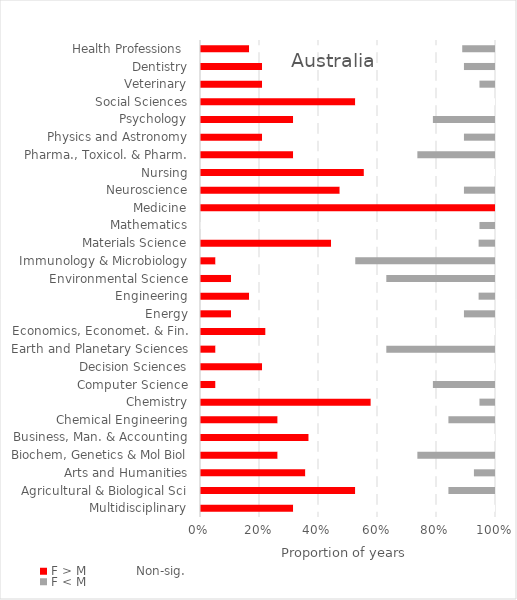
| Category | F > M | Non-sig. | F < M |
|---|---|---|---|
| Multidisciplinary | 6 | 13 | 0 |
| Agricultural & Biological Sci | 10 | 6 | 3 |
| Arts and Humanities | 5 | 8 | 1 |
| Biochem, Genetics & Mol Biol | 5 | 9 | 5 |
| Business, Man. & Accounting | 7 | 12 | 0 |
| Chemical Engineering | 5 | 11 | 3 |
| Chemistry | 11 | 7 | 1 |
| Computer Science | 1 | 14 | 4 |
| Decision Sciences | 4 | 15 | 0 |
| Earth and Planetary Sciences | 1 | 11 | 7 |
| Economics, Economet. & Fin. | 4 | 14 | 0 |
| Energy | 2 | 15 | 2 |
| Engineering | 3 | 14 | 1 |
| Environmental Science | 2 | 10 | 7 |
| Immunology & Microbiology | 1 | 9 | 9 |
| Materials Science | 8 | 9 | 1 |
| Mathematics | 0 | 18 | 1 |
| Medicine | 9 | 0 | 0 |
| Neuroscience | 9 | 8 | 2 |
| Nursing | 10 | 8 | 0 |
| Pharma., Toxicol. & Pharm. | 6 | 8 | 5 |
| Physics and Astronomy | 4 | 13 | 2 |
| Psychology | 6 | 9 | 4 |
| Social Sciences | 10 | 9 | 0 |
| Veterinary | 4 | 14 | 1 |
| Dentistry | 4 | 13 | 2 |
| Health Professions  | 3 | 13 | 2 |